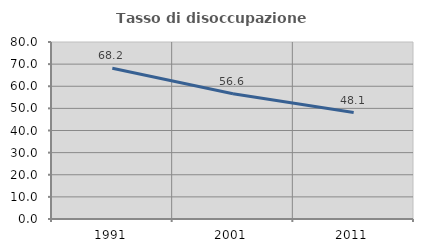
| Category | Tasso di disoccupazione giovanile  |
|---|---|
| 1991.0 | 68.151 |
| 2001.0 | 56.61 |
| 2011.0 | 48.106 |